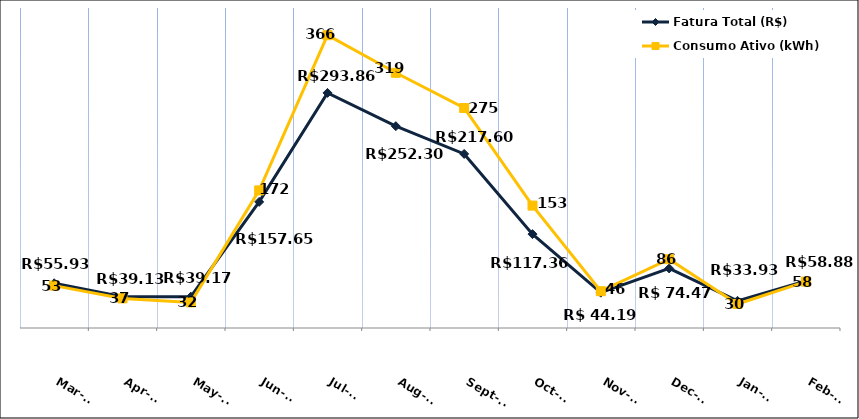
| Category | Fatura Total (R$) |
|---|---|
| 2022-03-01 | 55.93 |
| 2022-04-01 | 39.13 |
| 2022-05-01 | 39.17 |
| 2022-06-01 | 157.65 |
| 2022-07-01 | 293.86 |
| 2022-08-01 | 252.3 |
| 2022-09-01 | 217.6 |
| 2022-10-01 | 117.36 |
| 2022-11-01 | 44.19 |
| 2022-12-01 | 74.47 |
| 2023-01-01 | 33.93 |
| 2023-02-01 | 58.88 |